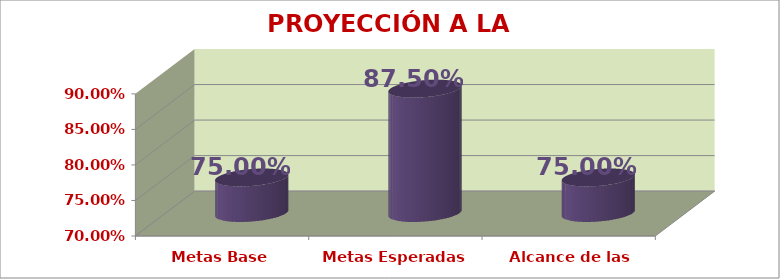
| Category | PROYECCIÓN A LA COMUNIDAD |
|---|---|
| Metas Base | 0.75 |
| Metas Esperadas | 0.875 |
| Alcance de las Metas | 0.75 |